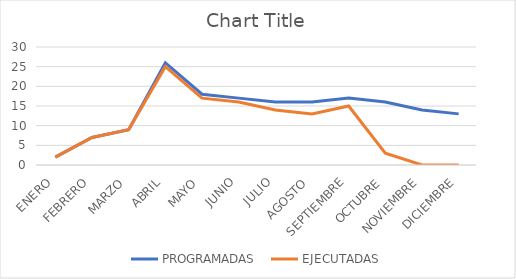
| Category | PROGRAMADAS  | EJECUTADAS |
|---|---|---|
| ENERO | 2 | 2 |
| FEBRERO | 7 | 7 |
| MARZO | 9 | 9 |
| ABRIL | 26 | 25 |
| MAYO | 18 | 17 |
| JUNIO | 17 | 16 |
| JULIO | 16 | 14 |
| AGOSTO | 16 | 13 |
| SEPTIEMBRE | 17 | 15 |
| OCTUBRE | 16 | 3 |
| NOVIEMBRE | 14 | 0 |
| DICIEMBRE | 13 | 0 |